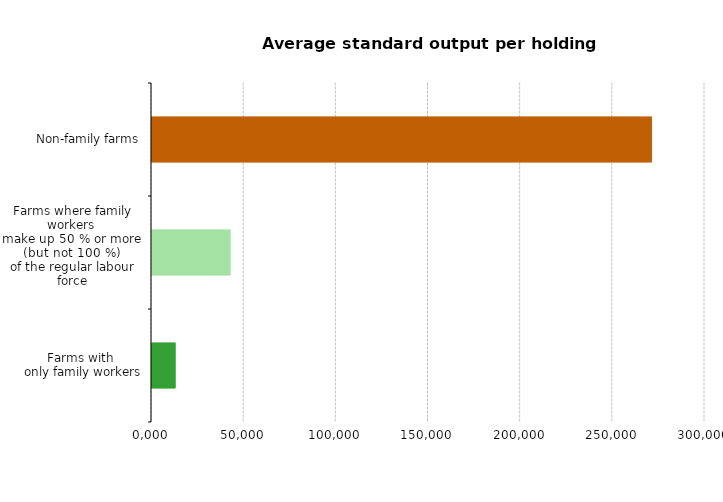
| Category | Average standard output per holding |
|---|---|
| Farms with 
only family workers | 12590.074 |
| Farms where family workers 
make up 50 % or more 
(but not 100 %) 
of the regular labour force | 42403.067 |
| Non-family farms | 271013 |